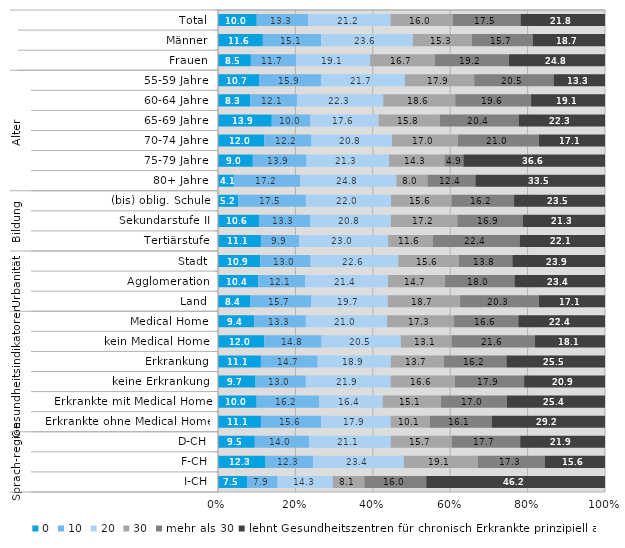
| Category | 0 | 10 | 20 | 30 | mehr als 30 | lehnt Gesundheitszentren für chronisch Erkrankte prinzipiell ab |
|---|---|---|---|---|---|---|
| 0 | 10 | 13.3 | 21.2 | 16 | 17.5 | 21.8 |
| 1 | 11.6 | 15.1 | 23.6 | 15.3 | 15.7 | 18.7 |
| 2 | 8.5 | 11.7 | 19.1 | 16.7 | 19.2 | 24.8 |
| 3 | 10.7 | 15.9 | 21.7 | 17.9 | 20.5 | 13.3 |
| 4 | 8.3 | 12.1 | 22.3 | 18.6 | 19.6 | 19.1 |
| 5 | 13.9 | 10 | 17.6 | 15.8 | 20.4 | 22.3 |
| 6 | 12 | 12.2 | 20.8 | 17 | 21 | 17.1 |
| 7 | 9 | 13.9 | 21.3 | 14.3 | 4.9 | 36.6 |
| 8 | 4.1 | 17.2 | 24.8 | 8 | 12.4 | 33.5 |
| 9 | 5.2 | 17.5 | 22 | 15.6 | 16.2 | 23.5 |
| 10 | 10.6 | 13.3 | 20.8 | 17.2 | 16.9 | 21.3 |
| 11 | 11.1 | 9.9 | 23 | 11.6 | 22.4 | 22.1 |
| 12 | 10.9 | 13 | 22.6 | 15.6 | 13.8 | 23.9 |
| 13 | 10.4 | 12.1 | 21.4 | 14.7 | 18 | 23.4 |
| 14 | 8.4 | 15.7 | 19.7 | 18.7 | 20.3 | 17.1 |
| 15 | 9.4 | 13.3 | 21 | 17.3 | 16.6 | 22.4 |
| 16 | 12 | 14.8 | 20.5 | 13.1 | 21.6 | 18.1 |
| 17 | 11.1 | 14.7 | 18.9 | 13.7 | 16.2 | 25.5 |
| 18 | 9.7 | 13 | 21.9 | 16.6 | 17.9 | 20.9 |
| 19 | 10 | 16.2 | 16.4 | 15.1 | 17 | 25.4 |
| 20 | 11.1 | 15.6 | 17.9 | 10.1 | 16.1 | 29.2 |
| 21 | 9.5 | 14 | 21.1 | 15.7 | 17.7 | 21.9 |
| 22 | 12.3 | 12.3 | 23.4 | 19.1 | 17.3 | 15.6 |
| 23 | 7.5 | 7.9 | 14.3 | 8.1 | 16 | 46.2 |